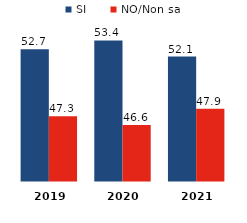
| Category | SI | NO/Non sa |
|---|---|---|
| 2019.0 | 52.7 | 47.3 |
| 2020.0 | 53.4 | 46.6 |
| 2021.0 | 52.1 | 47.9 |